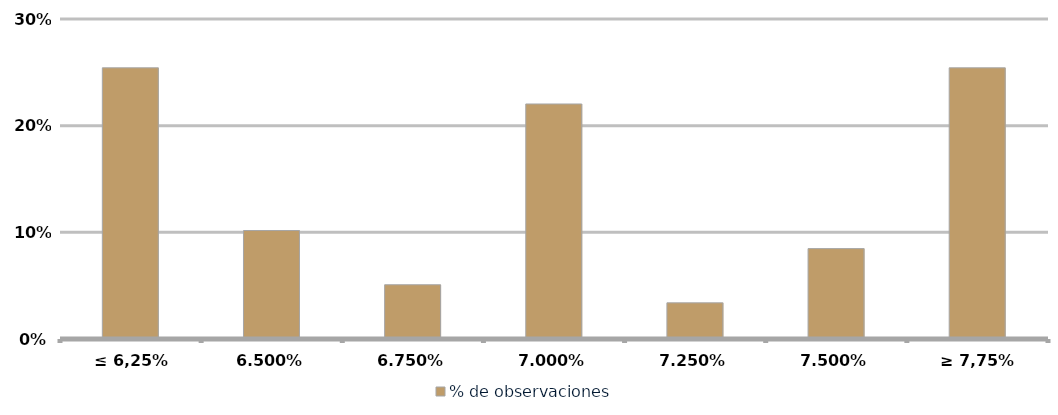
| Category | % de observaciones  |
|---|---|
| ≤ 6,25% | 0.254 |
| 6,50% | 0.102 |
| 6,75% | 0.051 |
| 7,00% | 0.22 |
| 7,25% | 0.034 |
| 7,50% | 0.085 |
| ≥ 7,75% | 0.254 |